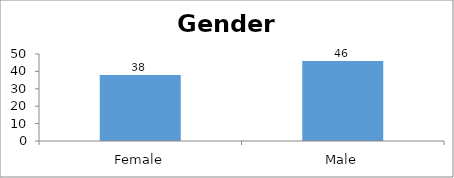
| Category | Gender |
|---|---|
| Female | 38 |
| Male | 46 |